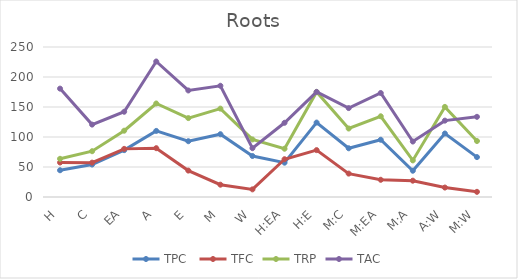
| Category | TPC  | TFC | TRP | TAC |
|---|---|---|---|---|
| H | 44.58 | 57.502 | 63.651 | 180.642 |
| C | 54.133 | 57.276 | 76.313 | 120.676 |
| EA | 78.074 | 80.219 | 110.5 | 142.089 |
| A | 110.136 | 81.357 | 155.84 | 225.841 |
| E | 92.967 | 44.03 | 131.511 | 177.558 |
| M | 104.664 | 20.519 | 147.291 | 185.39 |
| W | 68.327 | 12.734 | 95.947 | 81.359 |
| H:EA | 57.181 | 62.959 | 80.441 | 123.68 |
| H:E | 124.039 | 78.122 | 175.126 | 175.185 |
| M:C | 81.205 | 38.998 | 114.142 | 148.206 |
| M:EA | 95.427 | 28.708 | 134.506 | 173.331 |
| M:A | 43.778 | 27.186 | 61.005 | 92.435 |
| A:W | 105.799 | 15.753 | 150.176 | 127.285 |
| M:W | 66.49 | 8.616 | 93.292 | 133.632 |